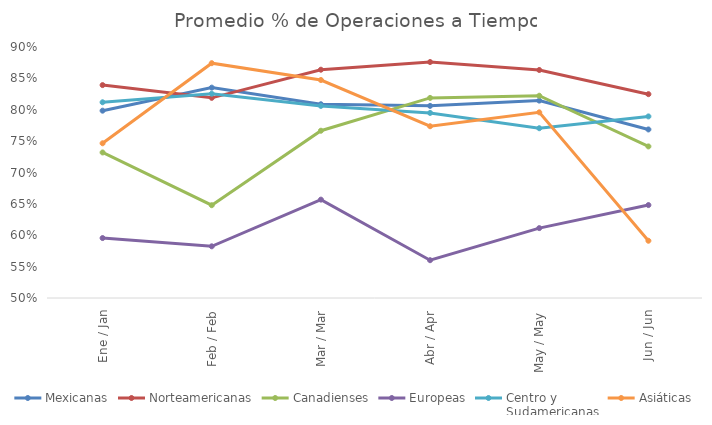
| Category | Mexicanas | Norteamericanas | Canadienses | Europeas | Centro y 
Sudamericanas | Asiáticas |
|---|---|---|---|---|---|---|
| Ene / Jan | 0.799 | 0.839 | 0.732 | 0.596 | 0.812 | 0.747 |
| Feb / Feb | 0.835 | 0.819 | 0.648 | 0.582 | 0.826 | 0.874 |
| Mar / Mar | 0.809 | 0.864 | 0.767 | 0.657 | 0.806 | 0.847 |
| Abr / Apr | 0.806 | 0.876 | 0.819 | 0.56 | 0.795 | 0.774 |
| May / May | 0.815 | 0.863 | 0.822 | 0.611 | 0.771 | 0.796 |
| Jun / Jun | 0.769 | 0.825 | 0.742 | 0.648 | 0.789 | 0.591 |